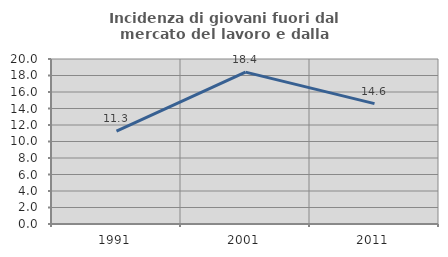
| Category | Incidenza di giovani fuori dal mercato del lavoro e dalla formazione  |
|---|---|
| 1991.0 | 11.264 |
| 2001.0 | 18.413 |
| 2011.0 | 14.591 |